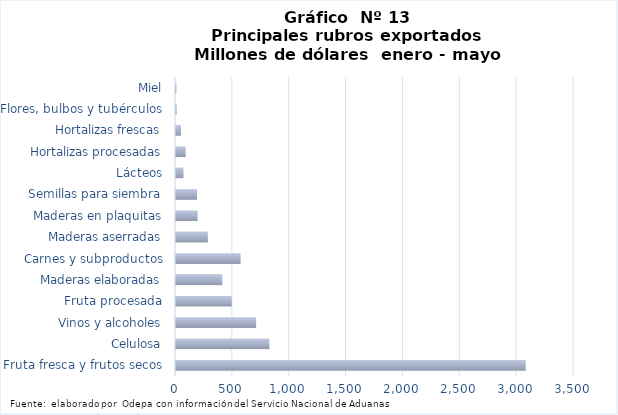
| Category | Series 7 |
|---|---|
| Fruta fresca y frutos secos | 3075195.486 |
| Celulosa | 821696.63 |
| Vinos y alcoholes | 705129.829 |
| Fruta procesada | 490179.46 |
| Maderas elaboradas | 407464.232 |
| Carnes y subproductos | 568137.294 |
| Maderas aserradas | 279997.485 |
| Maderas en plaquitas | 189977.886 |
| Semillas para siembra | 185033.72 |
| Lácteos | 65890.206 |
| Hortalizas procesadas | 84563.518 |
| Hortalizas frescas | 43330.21 |
| Flores, bulbos y tubérculos | 5478.806 |
| Miel | 3236.002 |